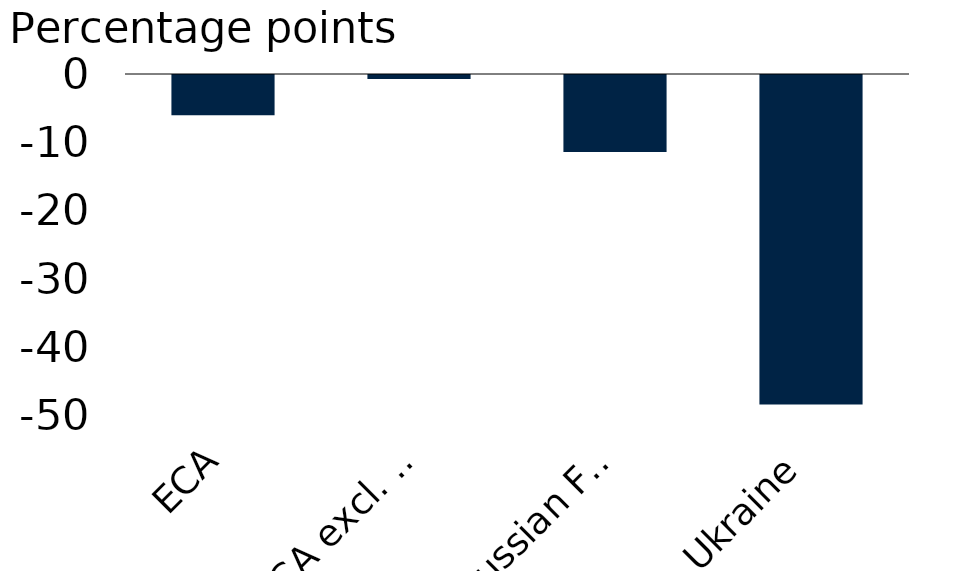
| Category | Downgrades relative to January 2022 GEP |
|---|---|
| ECA | -5.9 |
| ECA excl. Russian Federation and Ukraine | -0.6 |
| Russian Federation | -11.3 |
| Ukraine | -48.3 |